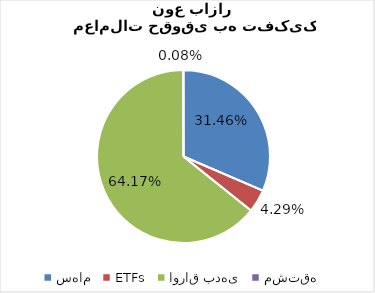
| Category | Series 0 |
|---|---|
| سهام | 0.315 |
| ETFs | 0.043 |
| اوراق بدهی | 0.642 |
| مشتقه | 0.001 |